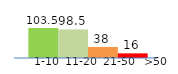
| Category | Series 0 | Series 1 | Series 2 | Series 3 |
|---|---|---|---|---|
| 0 | 103.5 | 98.5 | 38 | 16 |